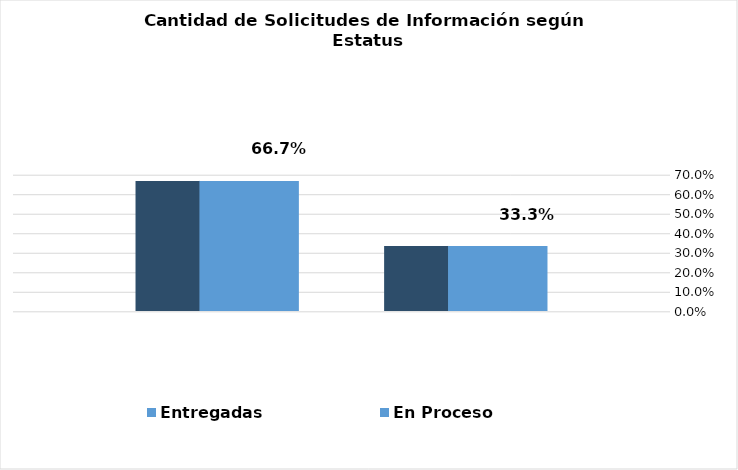
| Category | Entregadas | En Proceso |
|---|---|---|
|  | 0.667 | 0.333 |